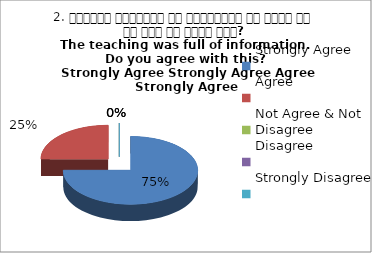
| Category | 2. शिक्षण जानकारी से परिपूर्ण था क्या आप इस बात से सहमत हैं?
The teaching was full of information. Do you agree with this?
 Strongly Agree Strongly Agree Agree Strongly Agree |
|---|---|
| Strongly Agree | 3 |
| Agree | 1 |
| Not Agree & Not Disagree | 0 |
| Disagree | 0 |
| Strongly Disagree | 0 |